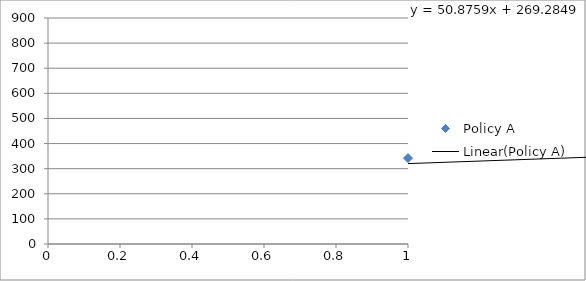
| Category | Policy A |
|---|---|
| 0 | 341.95 |
| 1 | 374.704 |
| 2 | 417.8 |
| 3 | 449.902 |
| 4 | 516.596 |
| 5 | 572.727 |
| 6 | 627.429 |
| 7 | 666.459 |
| 8 | 724.043 |
| 9 | 799.41 |